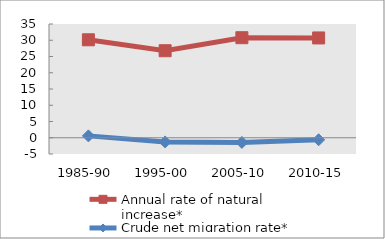
| Category | Annual rate of natural increase* | Crude net migration rate* |
|---|---|---|
| 1985-90 | 30.141 | 0.576 |
| 1995-00 | 26.778 | -1.287 |
| 2005-10 | 30.784 | -1.432 |
| 2010-15 | 30.71 | -0.617 |